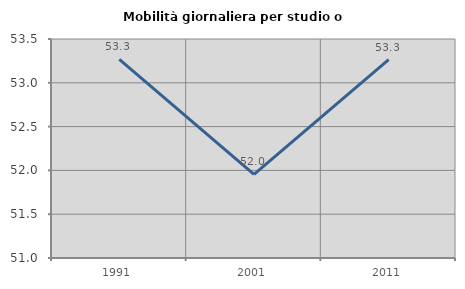
| Category | Mobilità giornaliera per studio o lavoro |
|---|---|
| 1991.0 | 53.267 |
| 2001.0 | 51.954 |
| 2011.0 | 53.264 |